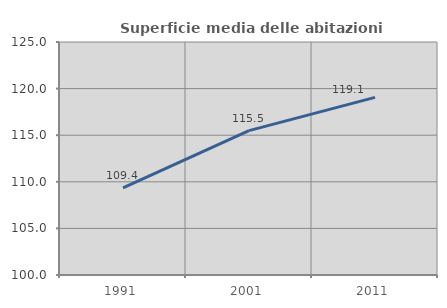
| Category | Superficie media delle abitazioni occupate |
|---|---|
| 1991.0 | 109.35 |
| 2001.0 | 115.495 |
| 2011.0 | 119.055 |